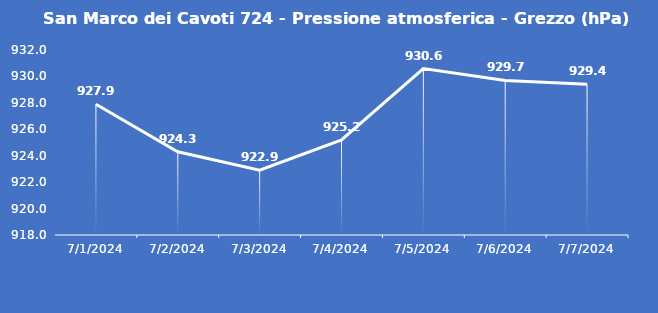
| Category | San Marco dei Cavoti 724 - Pressione atmosferica - Grezzo (hPa) |
|---|---|
| 7/1/24 | 927.9 |
| 7/2/24 | 924.3 |
| 7/3/24 | 922.9 |
| 7/4/24 | 925.2 |
| 7/5/24 | 930.6 |
| 7/6/24 | 929.7 |
| 7/7/24 | 929.4 |